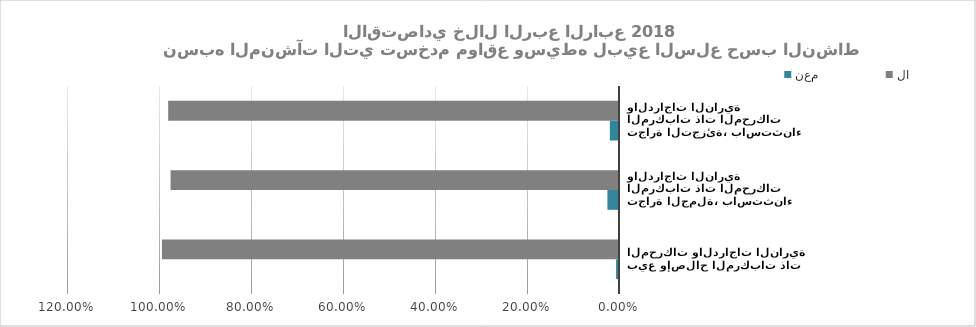
| Category | نعم | لا |
|---|---|---|
| بيع وإصلاح المركبات ذات المحركات والدراجات النارية | 0.006 | 0.994 |
| تجارة الجملة، باستثناء المركبات ذات المحركات والدراجات النارية | 0.025 | 0.975 |
| تجارة التجزئة، باستثناء المركبات ذات المحركات والدراجات النارية | 0.02 | 0.98 |